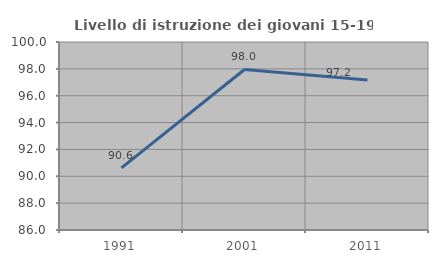
| Category | Livello di istruzione dei giovani 15-19 anni |
|---|---|
| 1991.0 | 90.625 |
| 2001.0 | 97.953 |
| 2011.0 | 97.173 |